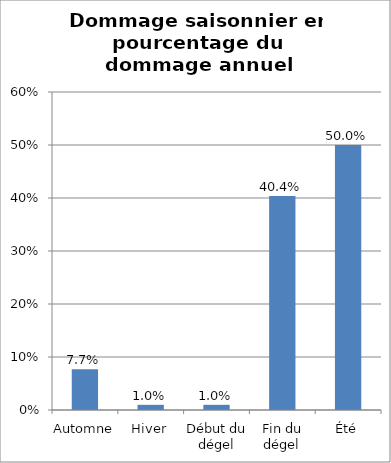
| Category | Series 0 |
|---|---|
| Automne | 0.077 |
| Hiver | 0.01 |
| Début du dégel | 0.01 |
| Fin du dégel | 0.404 |
| Été | 0.5 |